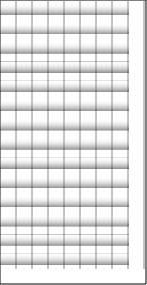
| Category | Series 0 |
|---|---|
| 0 | 8 |
| 1 | 8 |
| 2 | 8 |
| 3 | 8 |
| 4 | 8 |
| 5 | 8 |
| 6 | 8 |
| 7 | 8 |
| 8 | 8 |
| 9 | 8 |
| 10 | 8 |
| 11 | 8 |
| 12 | 8 |
| 13 | 8 |